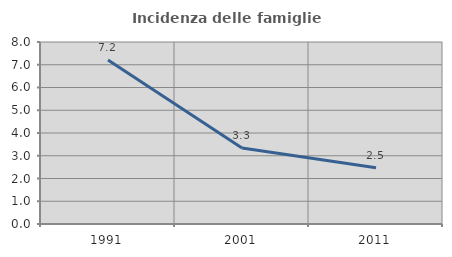
| Category | Incidenza delle famiglie numerose |
|---|---|
| 1991.0 | 7.207 |
| 2001.0 | 3.343 |
| 2011.0 | 2.469 |